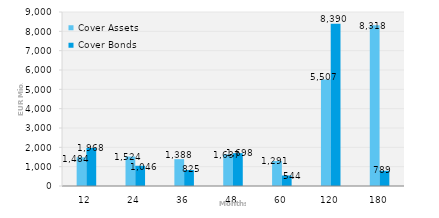
| Category | Cover Assets | Cover Bonds |
|---|---|---|
| 12.0 | 1483.766 | 1967.883 |
| 24.0 | 1523.655 | 1046 |
| 36.0 | 1387.817 | 825 |
| 48.0 | 1636.814 | 1697.5 |
| 60.0 | 1290.69 | 544 |
| 120.0 | 5506.863 | 8390.044 |
| 180.0 | 8317.6 | 788.948 |